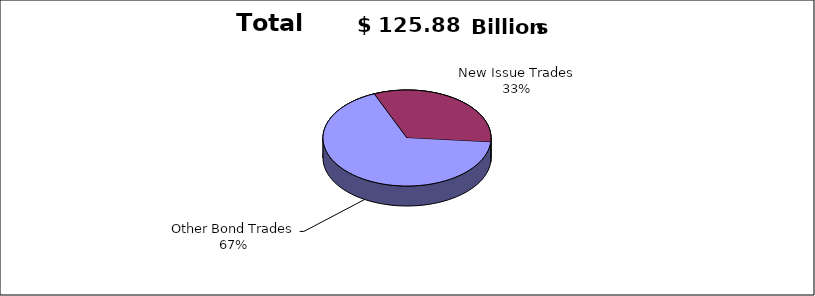
| Category | Series 0 |
|---|---|
| Other Bond Trades | 84607422176 |
| New Issue Trades | 41271464392 |